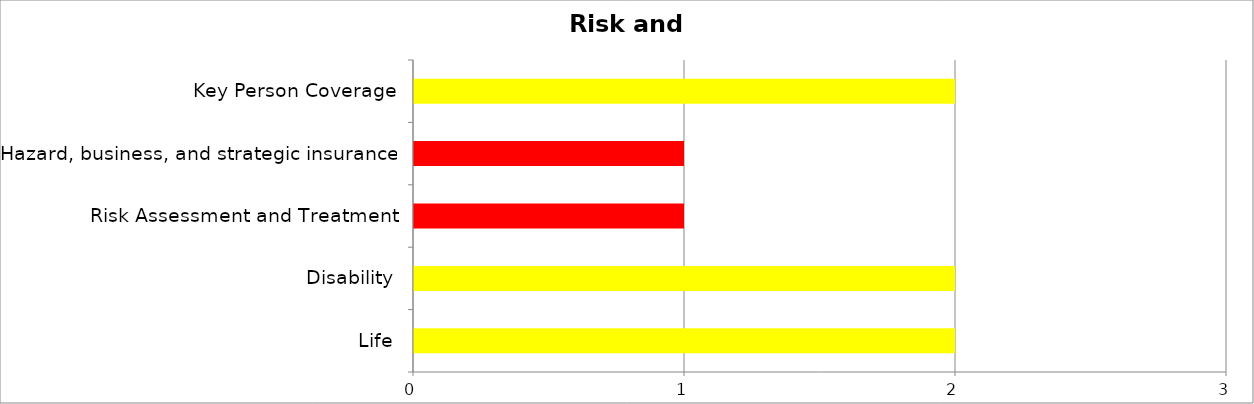
| Category | Series 0 | Series 1 | Series 2 |
|---|---|---|---|
| Life | 0 | 2 | 0 |
| Disability | 0 | 2 | 0 |
| Risk Assessment and Treatment | 0 | 0 | 1 |
| Hazard, business, and strategic insurance | 0 | 0 | 1 |
| Key Person Coverage | 0 | 2 | 0 |